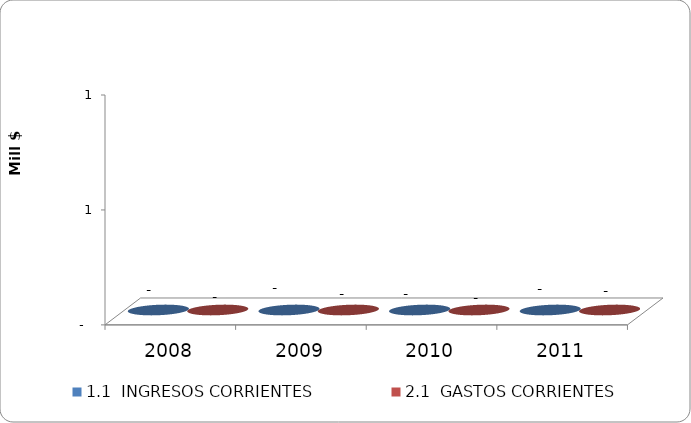
| Category | 1.1  INGRESOS CORRIENTES | 2.1  GASTOS CORRIENTES |
|---|---|---|
| 2008.0 | 0 | 0 |
| 2009.0 | 0 | 0 |
| 2010.0 | 0 | 0 |
| 2011.0 | 0 | 0 |